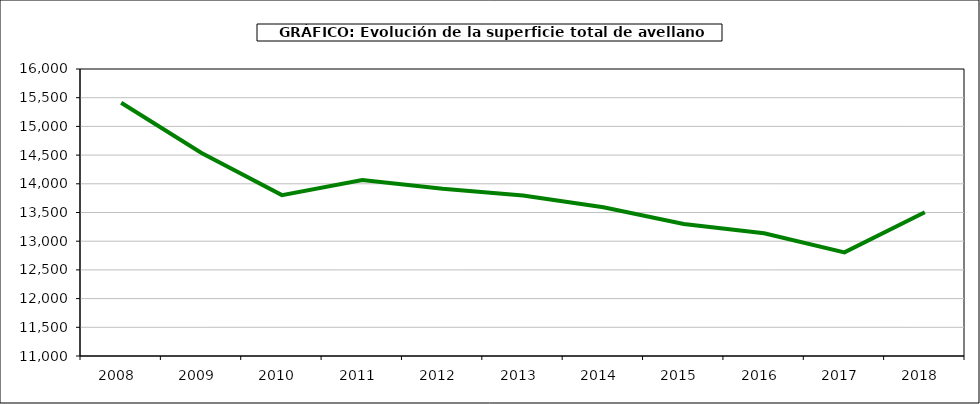
| Category | superficie avellano |
|---|---|
| 2008.0 | 15411 |
| 2009.0 | 14536 |
| 2010.0 | 13803 |
| 2011.0 | 14067 |
| 2012.0 | 13912 |
| 2013.0 | 13796 |
| 2014.0 | 13591 |
| 2015.0 | 13301 |
| 2016.0 | 13137 |
| 2017.0 | 12806 |
| 2018.0 | 13505 |